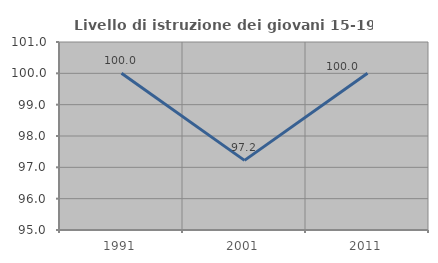
| Category | Livello di istruzione dei giovani 15-19 anni |
|---|---|
| 1991.0 | 100 |
| 2001.0 | 97.222 |
| 2011.0 | 100 |